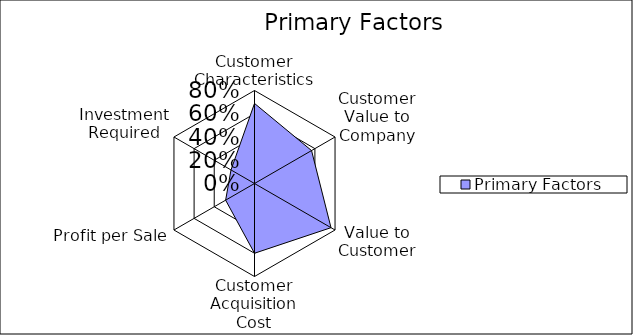
| Category | Primary Factors |
|---|---|
| Customer Characteristics | 0.689 |
| Customer Value to Company | 0.567 |
| Value to Customer | 0.76 |
| Customer Acquisition Cost | 0.6 |
| Profit per Sale | 0.287 |
| Investment Required | 0.233 |